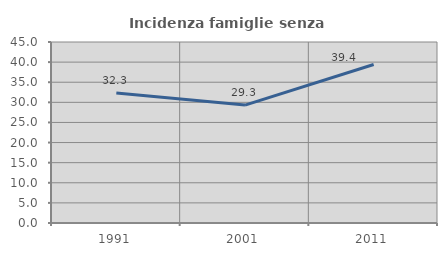
| Category | Incidenza famiglie senza nuclei |
|---|---|
| 1991.0 | 32.308 |
| 2001.0 | 29.31 |
| 2011.0 | 39.394 |